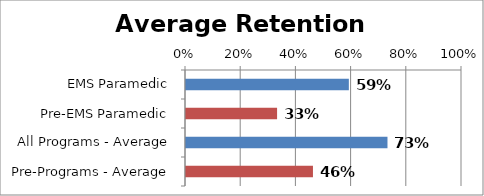
| Category | Series 0 |
|---|---|
| EMS Paramedic | 0.59 |
| Pre-EMS Paramedic | 0.33 |
| All Programs - Average | 0.73 |
| Pre-Programs - Average | 0.46 |